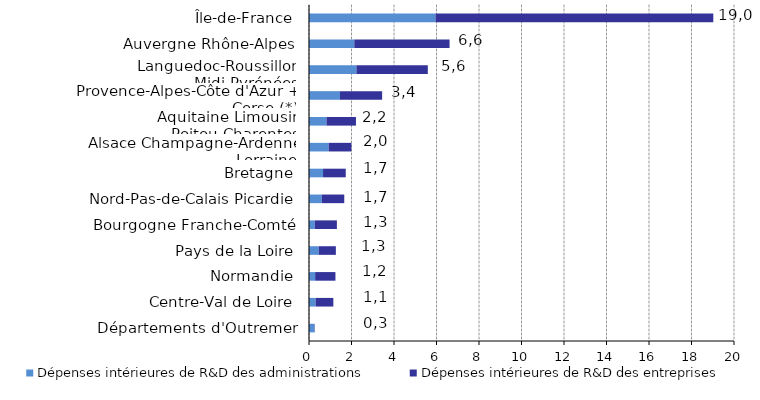
| Category | Dépenses intérieures de R&D des administrations  | Dépenses intérieures de R&D des entreprises  |
|---|---|---|
| Départements d'Outremer | 0.256 | 0.016 |
| Centre-Val de Loire | 0.309 | 0.837 |
| Normandie | 0.289 | 0.955 |
| Pays de la Loire | 0.461 | 0.803 |
| Bourgogne Franche-Comté | 0.27 | 1.042 |
| Nord-Pas-de-Calais Picardie | 0.604 | 1.055 |
| Bretagne | 0.661 | 1.069 |
| Alsace Champagne-Ardenne Lorraine | 0.924 | 1.07 |
| Aquitaine Limousin Poitou-Charentes | 0.823 | 1.387 |
| Provence-Alpes-Côte d'Azur + Corse (*) | 1.457 | 1.984 |
| Languedoc-Roussillon Midi-Pyrénées | 2.232 | 3.359 |
| Auvergne Rhône-Alpes | 2.132 | 4.483 |
| Île-de-France | 5.953 | 13.073 |